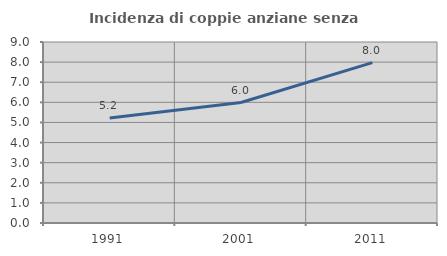
| Category | Incidenza di coppie anziane senza figli  |
|---|---|
| 1991.0 | 5.224 |
| 2001.0 | 5.99 |
| 2011.0 | 7.972 |